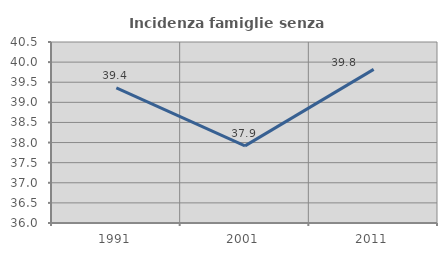
| Category | Incidenza famiglie senza nuclei |
|---|---|
| 1991.0 | 39.357 |
| 2001.0 | 37.918 |
| 2011.0 | 39.819 |